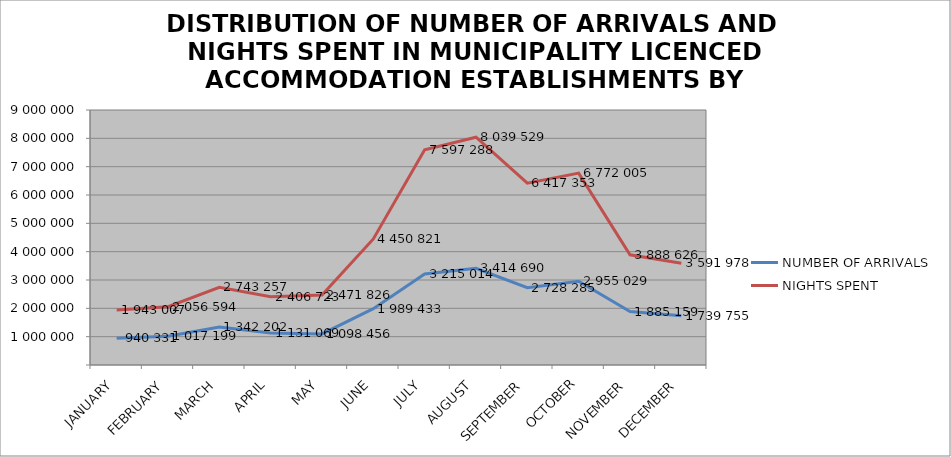
| Category | NUMBER OF ARRIVALS | NIGHTS SPENT |
|---|---|---|
| JANUARY | 940331 | 1943007 |
| FEBRUARY | 1017199 | 2056594 |
| MARCH | 1342202 | 2743257 |
| APRIL | 1131069 | 2406723 |
| MAY | 1098456 | 2471826 |
| JUNE | 1989433 | 4450821 |
| JULY | 3215014 | 7597288 |
| AUGUST | 3414690 | 8039529 |
| SEPTEMBER | 2728285 | 6417353 |
| OCTOBER | 2955029 | 6772005 |
| NOVEMBER | 1885159 | 3888626 |
| DECEMBER | 1739755 | 3591978 |